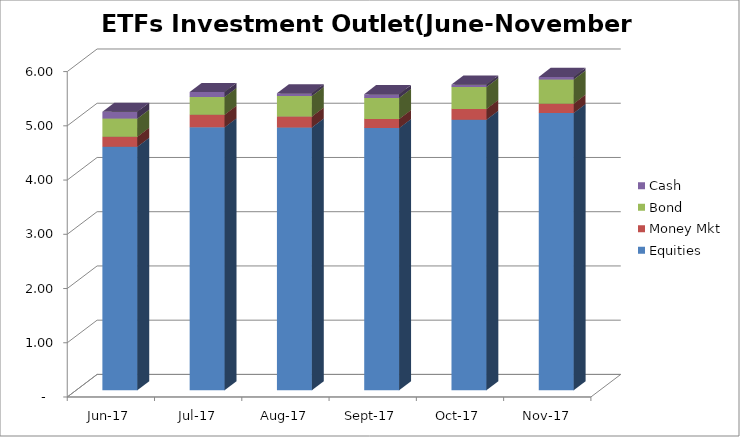
| Category | Equities | Money Mkt | Bond | Cash |
|---|---|---|---|---|
| 2017-06-01 | 4489263535.21 | 184470666.46 | 334603871.69 | 127093688.75 |
| 2017-07-01 | 4847218252.2 | 232984667.32 | 326329620.6 | 91679437.13 |
| 2017-08-01 | 4844657255.17 | 201591154.97 | 379243242.93 | 51169062.96 |
| 2017-09-01 | 4833111967.72 | 168172766.71 | 388932938.58 | 68776258.51 |
| 2017-10-01 | 4987236106.21 | 199138352.45 | 403914182.01 | 44490229.24 |
| 2017-11-01 | 5110642525.25 | 173439889.64 | 445730865.15 | 47372189.57 |